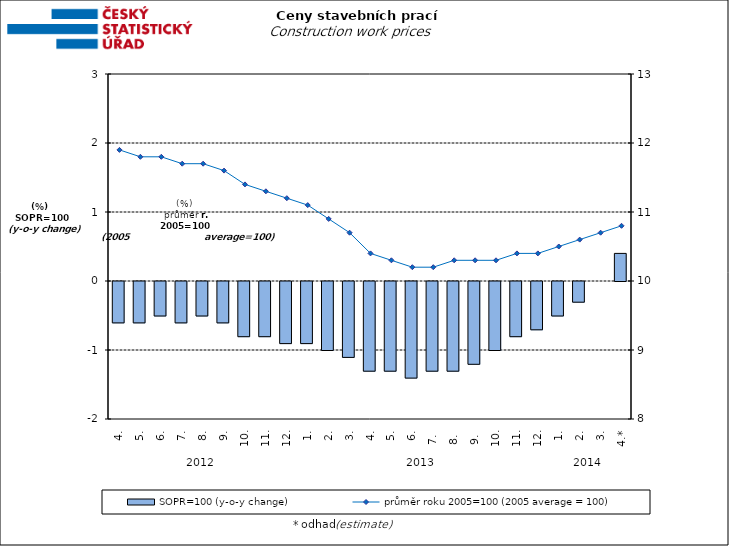
| Category | SOPR=100 (y-o-y change)   |
|---|---|
| 0 | -0.6 |
| 1 | -0.6 |
| 2 | -0.5 |
| 3 | -0.6 |
| 4 | -0.5 |
| 5 | -0.6 |
| 6 | -0.8 |
| 7 | -0.8 |
| 8 | -0.9 |
| 9 | -0.9 |
| 10 | -1 |
| 11 | -1.1 |
| 12 | -1.3 |
| 13 | -1.3 |
| 14 | -1.4 |
| 15 | -1.3 |
| 16 | -1.3 |
| 17 | -1.2 |
| 18 | -1 |
| 19 | -0.8 |
| 20 | -0.7 |
| 21 | -0.5 |
| 22 | -0.3 |
| 23 | 0 |
| 24 | 0.4 |